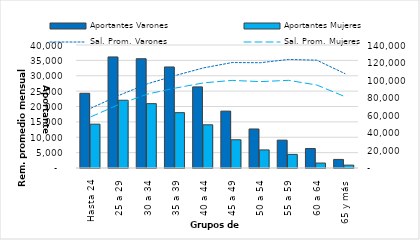
| Category | Aportantes Varones | Aportantes Mujeres |
|---|---|---|
| 0 | 85034 | 49869 |
| 1 | 126415 | 77106 |
| 2 | 124371 | 73257 |
| 3 | 115002 | 63009 |
| 4 | 92317 | 49182 |
| 5 | 64744 | 32130 |
| 6 | 44415 | 20593 |
| 7 | 31703 | 15486 |
| 8 | 22174 | 5639 |
| 9 | 9746 | 3285 |